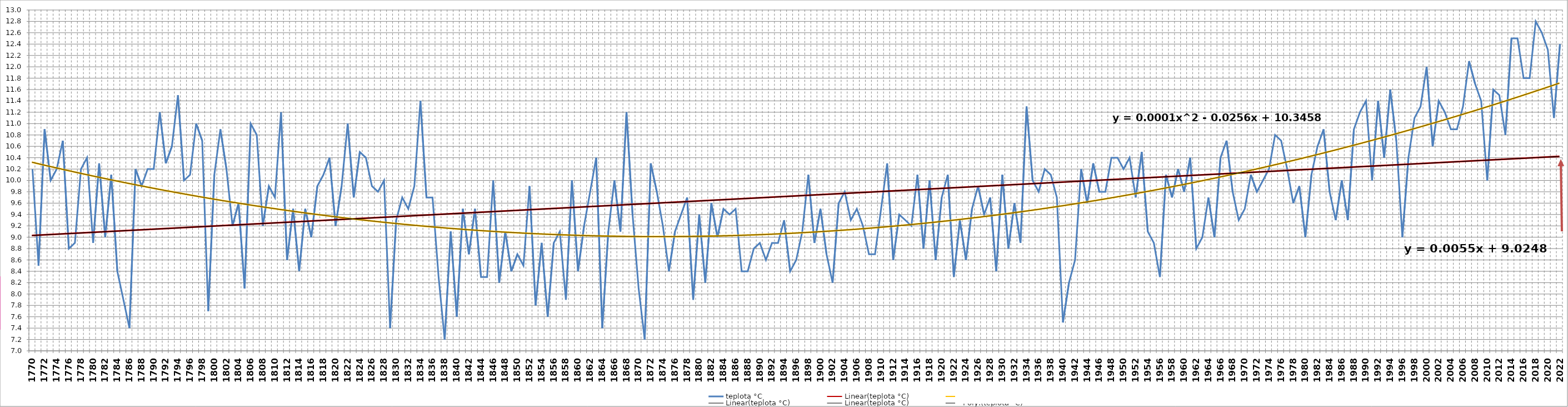
| Category | teplota °C |
|---|---|
| 1770 | 10.2 |
| 1771 | 8.5 |
| 1772 | 10.9 |
| 1773 | 10 |
| 1774 | 10.2 |
| 1775 | 10.7 |
| 1776 | 8.8 |
| 1777 | 8.9 |
| 1778 | 10.2 |
| 1779 | 10.4 |
| 1780 | 8.9 |
| 1781 | 10.3 |
| 1782 | 9 |
| 1783 | 10.1 |
| 1784 | 8.4 |
| 1785 | 7.9 |
| 1786 | 7.4 |
| 1787 | 10.2 |
| 1788 | 9.9 |
| 1789 | 10.2 |
| 1790 | 10.2 |
| 1791 | 11.2 |
| 1792 | 10.3 |
| 1793 | 10.6 |
| 1794 | 11.5 |
| 1795 | 10 |
| 1796 | 10.1 |
| 1797 | 11 |
| 1798 | 10.7 |
| 1799 | 7.7 |
| 1800 | 10.1 |
| 1801 | 10.9 |
| 1802 | 10.2 |
| 1803 | 9.2 |
| 1804 | 9.6 |
| 1805 | 8.1 |
| 1806 | 11 |
| 1807 | 10.8 |
| 1808 | 9.2 |
| 1809 | 9.9 |
| 1810 | 9.7 |
| 1811 | 11.2 |
| 1812 | 8.6 |
| 1813 | 9.5 |
| 1814 | 8.4 |
| 1815 | 9.5 |
| 1816 | 9 |
| 1817 | 9.9 |
| 1818 | 10.1 |
| 1819 | 10.4 |
| 1820 | 9.2 |
| 1821 | 9.9 |
| 1822 | 11 |
| 1823 | 9.7 |
| 1824 | 10.5 |
| 1825 | 10.4 |
| 1826 | 9.9 |
| 1827 | 9.8 |
| 1828 | 10 |
| 1829 | 7.4 |
| 1830 | 9.3 |
| 1831 | 9.7 |
| 1832 | 9.5 |
| 1833 | 9.9 |
| 1834 | 11.4 |
| 1835 | 9.7 |
| 1836 | 9.7 |
| 1837 | 8.3 |
| 1838 | 7.2 |
| 1839 | 9.1 |
| 1840 | 7.6 |
| 1841 | 9.5 |
| 1842 | 8.7 |
| 1843 | 9.5 |
| 1844 | 8.3 |
| 1845 | 8.3 |
| 1846 | 10 |
| 1847 | 8.2 |
| 1848 | 9.1 |
| 1849 | 8.4 |
| 1850 | 8.7 |
| 1851 | 8.5 |
| 1852 | 9.9 |
| 1853 | 7.8 |
| 1854 | 8.9 |
| 1855 | 7.6 |
| 1856 | 8.9 |
| 1857 | 9.1 |
| 1858 | 7.9 |
| 1859 | 10 |
| 1860 | 8.4 |
| 1861 | 9.2 |
| 1862 | 9.8 |
| 1863 | 10.4 |
| 1864 | 7.4 |
| 1865 | 9.1 |
| 1866 | 10 |
| 1867 | 9.1 |
| 1868 | 11.2 |
| 1869 | 9.4 |
| 1870 | 8.1 |
| 1871 | 7.2 |
| 1872 | 10.3 |
| 1873 | 9.8 |
| 1874 | 9.2 |
| 1875 | 8.4 |
| 1876 | 9.1 |
| 1877 | 9.4 |
| 1878 | 9.7 |
| 1879 | 7.9 |
| 1880 | 9.4 |
| 1881 | 8.2 |
| 1882 | 9.6 |
| 1883 | 9 |
| 1884 | 9.5 |
| 1885 | 9.4 |
| 1886 | 9.5 |
| 1887 | 8.4 |
| 1888 | 8.4 |
| 1889 | 8.8 |
| 1890 | 8.9 |
| 1891 | 8.6 |
| 1892 | 8.9 |
| 1893 | 8.9 |
| 1894 | 9.3 |
| 1895 | 8.4 |
| 1896 | 8.6 |
| 1897 | 9.1 |
| 1898 | 10.1 |
| 1899 | 8.9 |
| 1900 | 9.5 |
| 1901 | 8.7 |
| 1902 | 8.2 |
| 1903 | 9.6 |
| 1904 | 9.8 |
| 1905 | 9.3 |
| 1906 | 9.5 |
| 1907 | 9.2 |
| 1908 | 8.7 |
| 1909 | 8.7 |
| 1910 | 9.5 |
| 1911 | 10.3 |
| 1912 | 8.6 |
| 1913 | 9.4 |
| 1914 | 9.3 |
| 1915 | 9.2 |
| 1916 | 10.1 |
| 1917 | 8.8 |
| 1918 | 10 |
| 1919 | 8.6 |
| 1920 | 9.7 |
| 1921 | 10.1 |
| 1922 | 8.3 |
| 1923 | 9.3 |
| 1924 | 8.6 |
| 1925 | 9.5 |
| 1926 | 9.9 |
| 1927 | 9.4 |
| 1928 | 9.7 |
| 1929 | 8.4 |
| 1930 | 10.1 |
| 1931 | 8.8 |
| 1932 | 9.6 |
| 1933 | 8.9 |
| 1934 | 11.3 |
| 1935 | 10 |
| 1936 | 9.8 |
| 1937 | 10.2 |
| 1938 | 10.1 |
| 1939 | 9.7 |
| 1940 | 7.5 |
| 1941 | 8.2 |
| 1942 | 8.6 |
| 1943 | 10.2 |
| 1944 | 9.6 |
| 1945 | 10.3 |
| 1946 | 9.8 |
| 1947 | 9.8 |
| 1948 | 10.4 |
| 1949 | 10.4 |
| 1950 | 10.2 |
| 1951 | 10.4 |
| 1952 | 9.7 |
| 1953 | 10.5 |
| 1954 | 9.1 |
| 1955 | 8.9 |
| 1956 | 8.3 |
| 1957 | 10.1 |
| 1958 | 9.7 |
| 1959 | 10.2 |
| 1960 | 9.8 |
| 1961 | 10.4 |
| 1962 | 8.8 |
| 1963 | 9 |
| 1964 | 9.7 |
| 1965 | 9 |
| 1966 | 10.4 |
| 1967 | 10.7 |
| 1968 | 9.8 |
| 1969 | 9.3 |
| 1970 | 9.5 |
| 1971 | 10.1 |
| 1972 | 9.8 |
| 1973 | 10 |
| 1974 | 10.2 |
| 1975 | 10.8 |
| 1976 | 10.7 |
| 1977 | 10.2 |
| 1978 | 9.6 |
| 1979 | 9.9 |
| 1980 | 9 |
| 1981 | 10.1 |
| 1982 | 10.6 |
| 1983 | 10.9 |
| 1984 | 9.8 |
| 1985 | 9.3 |
| 1986 | 10 |
| 1987 | 9.3 |
| 1988 | 10.9 |
| 1989 | 11.2 |
| 1990 | 11.4 |
| 1991 | 10 |
| 1992 | 11.4 |
| 1993 | 10.4 |
| 1994 | 11.6 |
| 1995 | 10.7 |
| 1996 | 9 |
| 1997 | 10.4 |
| 1998 | 11.1 |
| 1999 | 11.3 |
| 2000 | 12 |
| 2001 | 10.6 |
| 2002 | 11.4 |
| 2003 | 11.2 |
| 2004 | 10.9 |
| 2005 | 10.9 |
| 2006 | 11.3 |
| 2007 | 12.1 |
| 2008 | 11.7 |
| 2009 | 11.4 |
| 2010 | 10 |
| 2011 | 11.6 |
| 2012 | 11.5 |
| 2013 | 10.8 |
| 2014 | 12.5 |
| 2015 | 12.5 |
| 2016 | 11.8 |
| 2017 | 11.8 |
| 2018 | 12.8 |
| 2019 | 12.6 |
| 2020 | 12.3 |
| 2021 | 11.1 |
| 2022 | 12.4 |